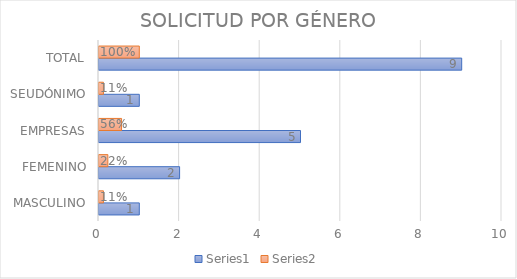
| Category | Series 0 | Series 1 |
|---|---|---|
| MASCULINO | 1 | 0.11 |
| FEMENINO | 2 | 0.22 |
| EMPRESAS | 5 | 0.56 |
| SEUDÓNIMO | 1 | 0.11 |
| TOTAL | 9 | 1 |